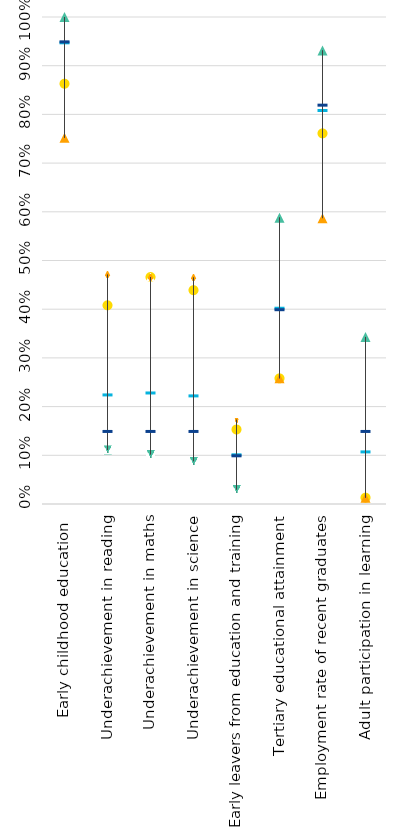
| Category | Romania | Strongest performer | Weakest performer | EU average | EU target |
|---|---|---|---|---|---|
| Early childhood education  | 0.863 | 1 | 0.752 | 0.948 | 0.95 |
| Underachievement in reading | 0.408 | 0.111 | 0.471 | 0.225 | 0.15 |
| Underachievement in maths | 0.466 | 0.102 | 0.466 | 0.229 | 0.15 |
| Underachievement in science | 0.439 | 0.088 | 0.465 | 0.223 | 0.15 |
| Early leavers from education and training | 0.153 | 0.03 | 0.173 | 0.102 | 0.1 |
| Tertiary educational attainment | 0.258 | 0.588 | 0.258 | 0.403 | 0.4 |
| Employment rate of recent graduates | 0.761 | 0.931 | 0.587 | 0.809 | 0.82 |
| Adult participation in learning | 0.013 | 0.343 | 0.013 | 0.108 | 0.15 |